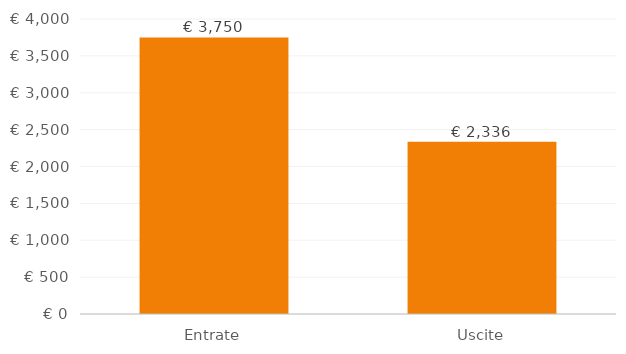
| Category | DatiGrafico |
|---|---|
| 0 | 3750 |
| 1 | 2336 |